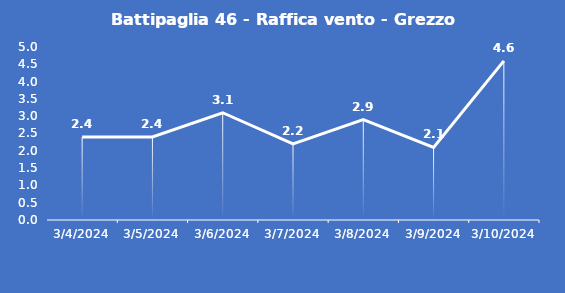
| Category | Battipaglia 46 - Raffica vento - Grezzo (m/s) |
|---|---|
| 3/4/24 | 2.4 |
| 3/5/24 | 2.4 |
| 3/6/24 | 3.1 |
| 3/7/24 | 2.2 |
| 3/8/24 | 2.9 |
| 3/9/24 | 2.1 |
| 3/10/24 | 4.6 |